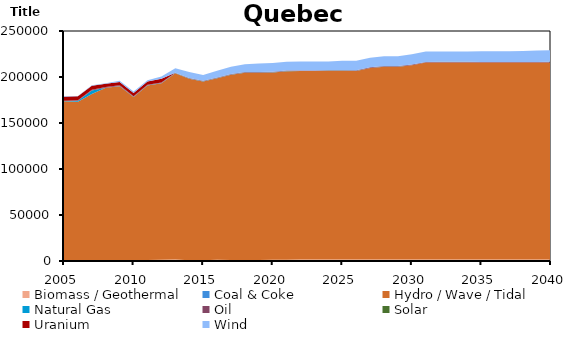
| Category | Biomass / Geothermal | Coal & Coke | Hydro / Wave / Tidal | Natural Gas | Oil | Solar | Uranium | Wind |
|---|---|---|---|---|---|---|---|---|
| 2005.0 | 646 | 0 | 173112.6 | 269 | 215.133 | 0 | 4321.577 | 416 |
| 2006.0 | 646 | 0 | 172347.6 | 1326 | 400.9 | 0 | 4321.577 | 419 |
| 2007.0 | 646 | 0 | 180856.6 | 3945 | 703.7 | 0 | 4321.577 | 617 |
| 2008.0 | 439 | 0 | 187783.8 | 228 | 554.3 | 0 | 3624.231 | 565 |
| 2009.0 | 550 | 0 | 189423 | 264 | 778.7 | 0 | 3596.279 | 1322 |
| 2010.0 | 843.915 | 0 | 177402.2 | 222.4 | 587.685 | 0 | 3551.588 | 1535.143 |
| 2011.0 | 1088.819 | 0 | 189675.6 | 174.241 | 546.181 | 0 | 3525.216 | 1393.797 |
| 2012.0 | 1232.854 | 0 | 191955.4 | 185.006 | 518.646 | 0 | 4212.618 | 2557.792 |
| 2013.0 | 1613.836 | 0 | 202512.3 | 112.844 | 475.064 | 0 | 0 | 4717.861 |
| 2014.0 | 943.515 | 0 | 197207.4 | 156.537 | 496.685 | 0 | 0 | 6649.311 |
| 2015.0 | 803.8 | 0 | 194366.2 | 137.865 | 548.037 | 0 | 0 | 6420.621 |
| 2016.0 | 1371.83 | 0 | 197242.9 | 166.88 | 697.963 | 0 | 0 | 7360.26 |
| 2017.0 | 1059.03 | 0 | 201382.7 | 154.329 | 567.449 | 0 | 0 | 8038.111 |
| 2018.0 | 1121.121 | 0 | 203630.5 | 153.991 | 567.448 | 0.26 | 0 | 8271.886 |
| 2019.0 | 1121.121 | 0 | 203630.5 | 153.983 | 567.448 | 0.26 | 0 | 9312.853 |
| 2020.0 | 1288.893 | 0 | 203693.3 | 153.983 | 567.448 | 17.78 | 0 | 9590.726 |
| 2021.0 | 1369.834 | 0 | 204953 | 153.983 | 567.447 | 17.78 | 0 | 9590.709 |
| 2022.0 | 1495.979 | 0 | 204953.1 | 153.983 | 567.448 | 17.78 | 0 | 9590.722 |
| 2023.0 | 1495.978 | 0 | 204952.9 | 153.983 | 567.447 | 17.78 | 0 | 9590.709 |
| 2024.0 | 1495.978 | 0 | 204953 | 153.983 | 567.447 | 35.3 | 0 | 9590.707 |
| 2025.0 | 1495.979 | 0 | 204953.1 | 153.983 | 567.448 | 35.3 | 0 | 10466.72 |
| 2026.0 | 1622.122 | 0 | 204953 | 153.983 | 567.447 | 35.3 | 0 | 10466.71 |
| 2027.0 | 1622.123 | 0 | 208139.9 | 153.983 | 567.447 | 35.3 | 0 | 10466.71 |
| 2028.0 | 1622.122 | 0 | 209604.2 | 153.983 | 567.447 | 52.82 | 0 | 10466.71 |
| 2029.0 | 1622.124 | 0 | 209604.4 | 153.983 | 567.448 | 52.82 | 0 | 10466.72 |
| 2030.0 | 1664.172 | 0 | 211068.7 | 153.983 | 567.448 | 52.82 | 0 | 11342.72 |
| 2031.0 | 1664.17 | 0 | 213997.2 | 153.983 | 567.447 | 52.82 | 0 | 11342.71 |
| 2032.0 | 1664.17 | 0 | 213997.2 | 153.991 | 567.447 | 79.1 | 0 | 11342.71 |
| 2033.0 | 1664.171 | 0 | 213997.3 | 154.009 | 567.447 | 79.1 | 0 | 11342.72 |
| 2034.0 | 1664.17 | 0 | 213997.2 | 153.996 | 567.447 | 79.1 | 0 | 11342.71 |
| 2035.0 | 1664.172 | 0 | 213997.5 | 153.996 | 417.169 | 79.1 | 0 | 11649.33 |
| 2036.0 | 1664.171 | 0 | 213997.2 | 154.009 | 417.169 | 105.38 | 0 | 11649.31 |
| 2037.0 | 1664.171 | 0 | 213997.3 | 154.009 | 417.169 | 105.38 | 0 | 11649.32 |
| 2038.0 | 1664.172 | 0 | 213997.3 | 154.022 | 417.169 | 105.38 | 0 | 11999.73 |
| 2039.0 | 1664.171 | 0 | 213997.3 | 154.022 | 417.169 | 171.08 | 0 | 12350.11 |
| 2040.0 | 1664.17 | 0 | 213997.2 | 154.031 | 417.168 | 263.06 | 0 | 12700.5 |